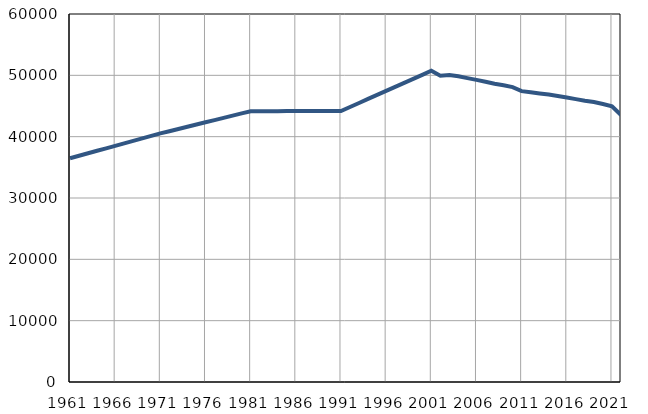
| Category | Population
size |
|---|---|
| 1961.0 | 36484 |
| 1962.0 | 36889 |
| 1963.0 | 37293 |
| 1964.0 | 37698 |
| 1965.0 | 38102 |
| 1966.0 | 38506 |
| 1967.0 | 38912 |
| 1968.0 | 39316 |
| 1969.0 | 39721 |
| 1970.0 | 40125 |
| 1971.0 | 40530 |
| 1972.0 | 40892 |
| 1973.0 | 41254 |
| 1974.0 | 41616 |
| 1975.0 | 41978 |
| 1976.0 | 42340 |
| 1977.0 | 42703 |
| 1978.0 | 43065 |
| 1979.0 | 43427 |
| 1980.0 | 43789 |
| 1981.0 | 44151 |
| 1982.0 | 44154 |
| 1983.0 | 44158 |
| 1984.0 | 44161 |
| 1985.0 | 44165 |
| 1986.0 | 44168 |
| 1987.0 | 44171 |
| 1988.0 | 44175 |
| 1989.0 | 44178 |
| 1990.0 | 44181 |
| 1991.0 | 44185 |
| 1992.0 | 44841 |
| 1993.0 | 45496 |
| 1994.0 | 46152 |
| 1995.0 | 46807 |
| 1996.0 | 47463 |
| 1997.0 | 48118 |
| 1998.0 | 48774 |
| 1999.0 | 49429 |
| 2000.0 | 50085 |
| 2001.0 | 50740 |
| 2002.0 | 49940 |
| 2003.0 | 50068 |
| 2004.0 | 49848 |
| 2005.0 | 49548 |
| 2006.0 | 49258 |
| 2007.0 | 48944 |
| 2008.0 | 48624 |
| 2009.0 | 48376 |
| 2010.0 | 48075 |
| 2011.0 | 47428 |
| 2012.0 | 47235 |
| 2013.0 | 47046 |
| 2014.0 | 46871 |
| 2015.0 | 46641 |
| 2016.0 | 46390 |
| 2017.0 | 46119 |
| 2018.0 | 45854 |
| 2019.0 | 45642 |
| 2020.0 | 45336 |
| 2021.0 | 44964 |
| 2022.0 | 43509 |